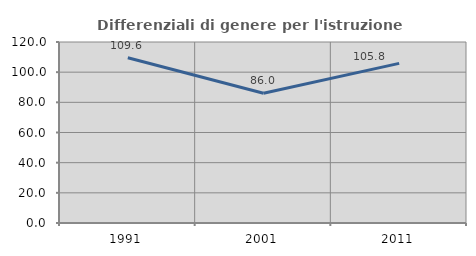
| Category | Differenziali di genere per l'istruzione superiore |
|---|---|
| 1991.0 | 109.592 |
| 2001.0 | 85.987 |
| 2011.0 | 105.817 |